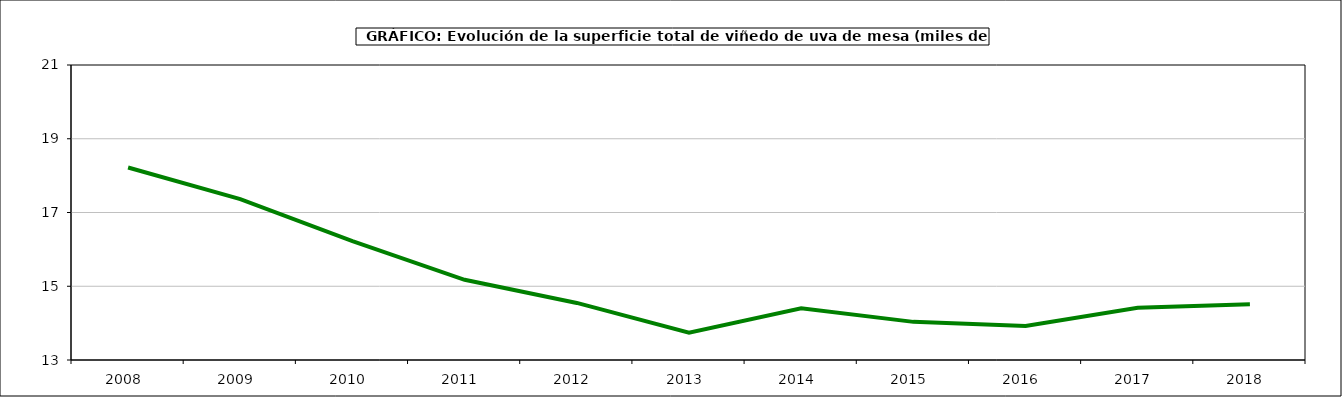
| Category | superficie |
|---|---|
| 2008.0 | 18.221 |
| 2009.0 | 17.362 |
| 2010.0 | 16.226 |
| 2011.0 | 15.175 |
| 2012.0 | 14.548 |
| 2013.0 | 13.742 |
| 2014.0 | 14.403 |
| 2015.0 | 14.034 |
| 2016.0 | 13.925 |
| 2017.0 | 14.416 |
| 2018.0 | 14.509 |